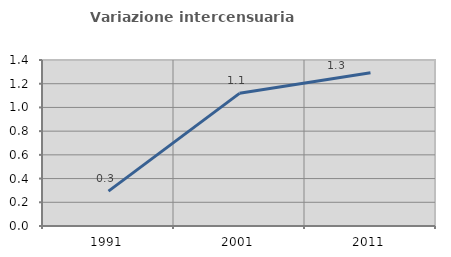
| Category | Variazione intercensuaria annua |
|---|---|
| 1991.0 | 0.294 |
| 2001.0 | 1.119 |
| 2011.0 | 1.293 |